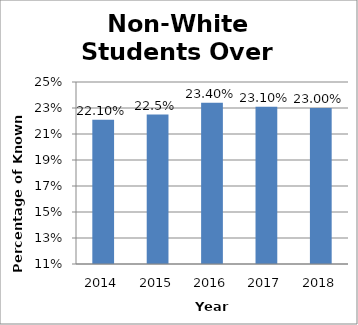
| Category | Series 0 |
|---|---|
| 2014.0 | 0.221 |
| 2015.0 | 0.225 |
| 2016.0 | 0.234 |
| 2017.0 | 0.231 |
| 2018.0 | 0.23 |